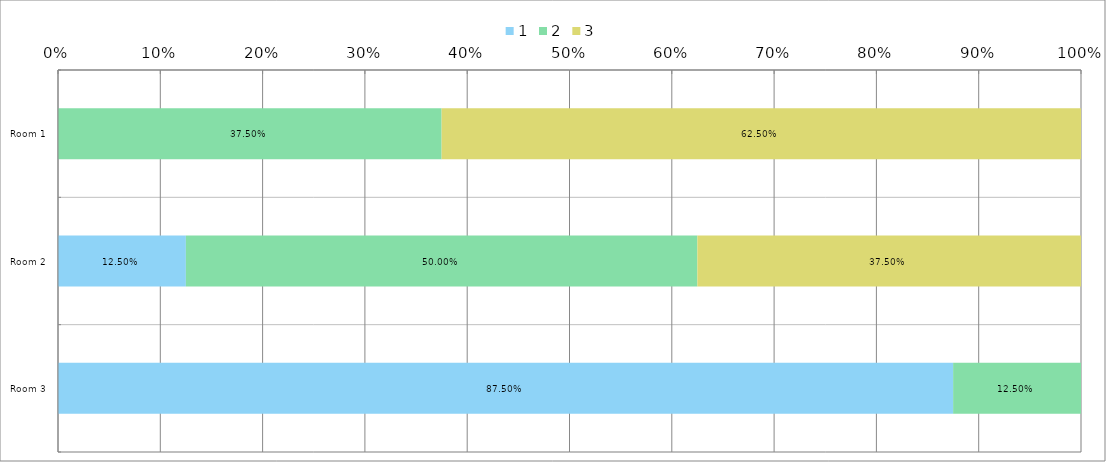
| Category | 1 | 2 | 3 |
|---|---|---|---|
| 0 | 0 | 0.375 | 0.625 |
| 1 | 0.125 | 0.5 | 0.375 |
| 2 | 0.875 | 0.125 | 0 |